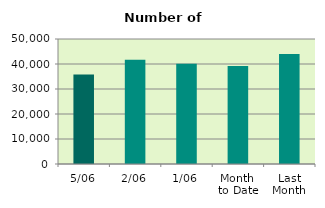
| Category | Series 0 |
|---|---|
| 5/06 | 35812 |
| 2/06 | 41696 |
| 1/06 | 40100 |
| Month 
to Date | 39202.667 |
| Last
Month | 44009.364 |